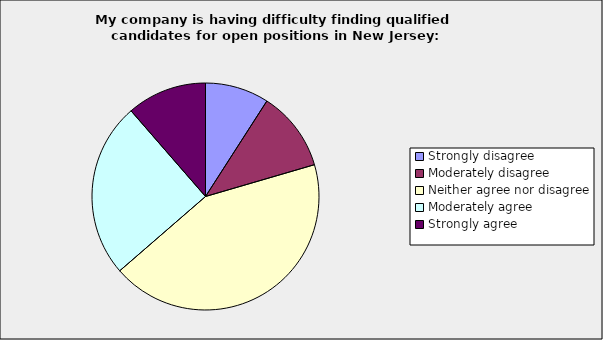
| Category | Series 0 |
|---|---|
| Strongly disagree | 0.091 |
| Moderately disagree | 0.114 |
| Neither agree nor disagree | 0.432 |
| Moderately agree | 0.25 |
| Strongly agree | 0.114 |